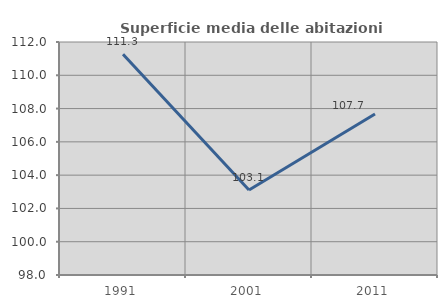
| Category | Superficie media delle abitazioni occupate |
|---|---|
| 1991.0 | 111.258 |
| 2001.0 | 103.111 |
| 2011.0 | 107.678 |